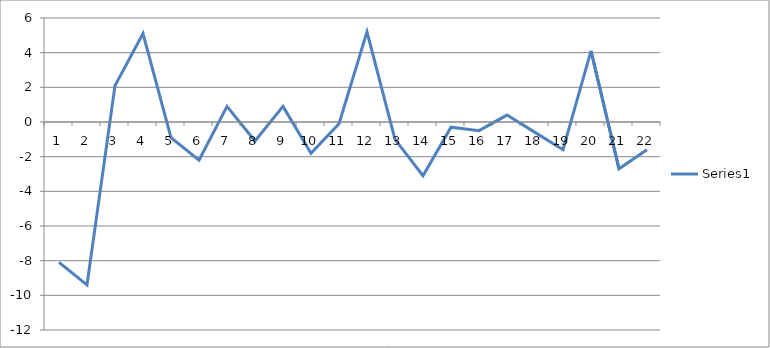
| Category | Series 0 |
|---|---|
| 0 | -8.1 |
| 1 | -9.4 |
| 2 | 2.1 |
| 3 | 5.1 |
| 4 | -0.9 |
| 5 | -2.2 |
| 6 | 0.9 |
| 7 | -1.1 |
| 8 | 0.9 |
| 9 | -1.8 |
| 10 | -0.1 |
| 11 | 5.2 |
| 12 | -1 |
| 13 | -3.1 |
| 14 | -0.3 |
| 15 | -0.5 |
| 16 | 0.4 |
| 17 | -0.6 |
| 18 | -1.6 |
| 19 | 4.1 |
| 20 | -2.7 |
| 21 | -1.6 |